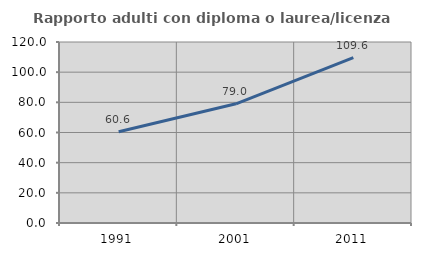
| Category | Rapporto adulti con diploma o laurea/licenza media  |
|---|---|
| 1991.0 | 60.553 |
| 2001.0 | 79.016 |
| 2011.0 | 109.581 |